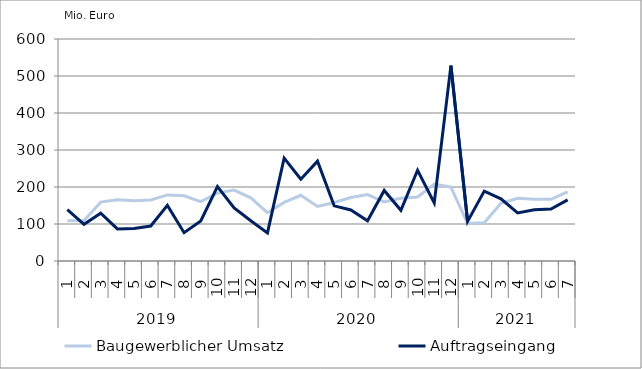
| Category | Baugewerblicher Umsatz | Auftragseingang |
|---|---|---|
| 0 | 108616.605 | 139065.287 |
| 1 | 109331.58 | 99318.609 |
| 2 | 159117.81 | 129002.041 |
| 3 | 165654.287 | 86579.2 |
| 4 | 162976.056 | 87644.362 |
| 5 | 165026.188 | 94463.186 |
| 6 | 178622.938 | 150345.08 |
| 7 | 176074.101 | 76434.317 |
| 8 | 160663.041 | 108444.162 |
| 9 | 183589.485 | 201122.697 |
| 10 | 191777.213 | 143514.792 |
| 11 | 170885.223 | 108780.022 |
| 12 | 130445.562 | 75891.481 |
| 13 | 158433.655 | 277923.85 |
| 14 | 177529.832 | 220973.626 |
| 15 | 147259.799 | 269936.091 |
| 16 | 157965.891 | 149072.895 |
| 17 | 171647.778 | 137984.76 |
| 18 | 179530.732 | 108645.965 |
| 19 | 159480.457 | 190771.468 |
| 20 | 169638.111 | 136988.906 |
| 21 | 173040.053 | 245341.603 |
| 22 | 207619.085 | 156647.224 |
| 23 | 199947.086 | 528166.004 |
| 24 | 101295.895 | 106850.127 |
| 25 | 103236.543 | 188883.434 |
| 26 | 156172.725 | 168204.42 |
| 27 | 169257.088 | 130052.073 |
| 28 | 166897.821 | 138492.214 |
| 29 | 166720.216 | 140262.426 |
| 30 | 186515.191 | 165331.191 |